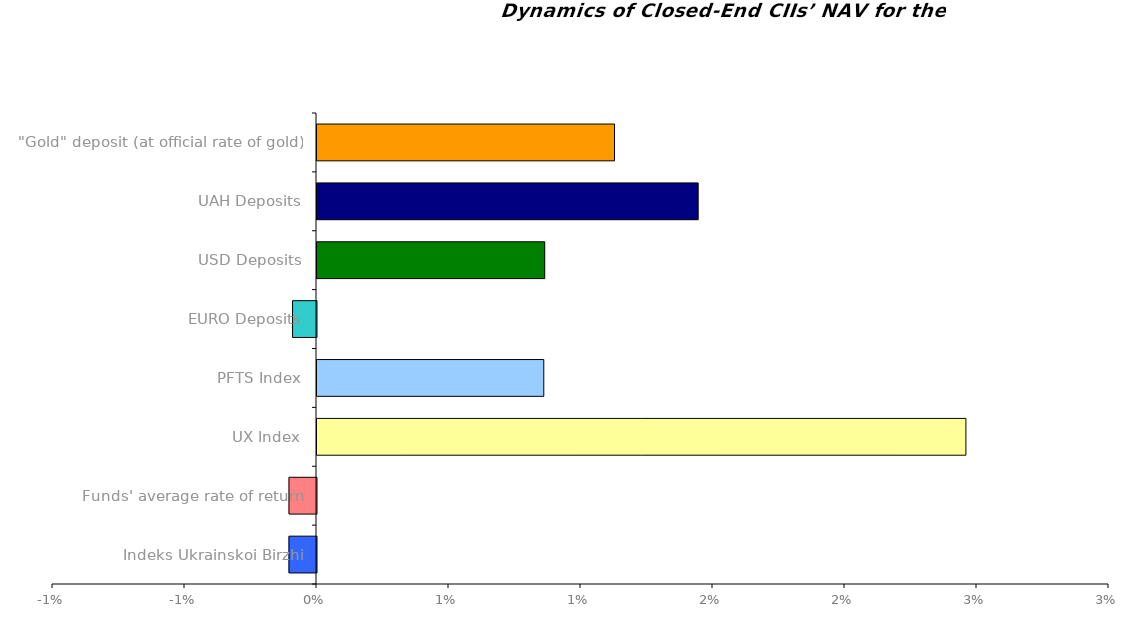
| Category | Series 0 |
|---|---|
| Іndeks Ukrainskoi Birzhi | -0.001 |
| Funds' average rate of return | -0.001 |
| UX Index | 0.025 |
| PFTS Index | 0.009 |
| EURO Deposits | -0.001 |
| USD Deposits | 0.009 |
| UAH Deposits | 0.014 |
| "Gold" deposit (at official rate of gold) | 0.011 |